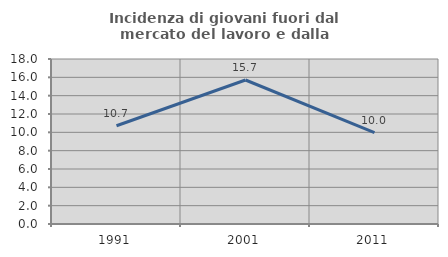
| Category | Incidenza di giovani fuori dal mercato del lavoro e dalla formazione  |
|---|---|
| 1991.0 | 10.714 |
| 2001.0 | 15.709 |
| 2011.0 | 9.959 |